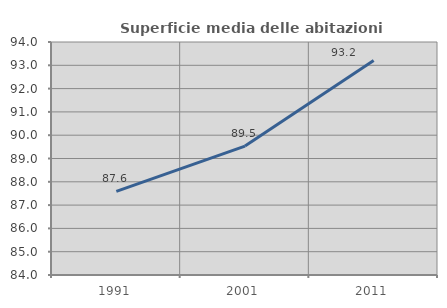
| Category | Superficie media delle abitazioni occupate |
|---|---|
| 1991.0 | 87.589 |
| 2001.0 | 89.531 |
| 2011.0 | 93.211 |